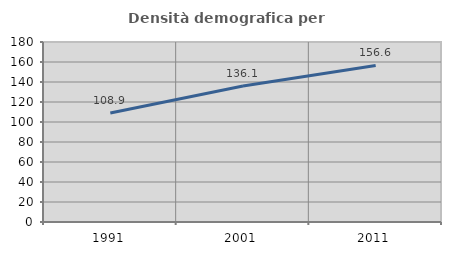
| Category | Densità demografica |
|---|---|
| 1991.0 | 108.916 |
| 2001.0 | 136.075 |
| 2011.0 | 156.583 |